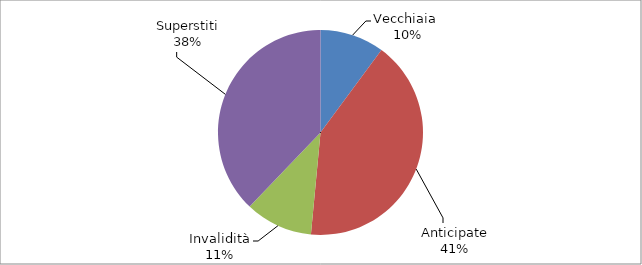
| Category | Series 0 |
|---|---|
| Vecchiaia  | 24520 |
| Anticipate | 100049 |
| Invalidità | 25769 |
| Superstiti | 91576 |